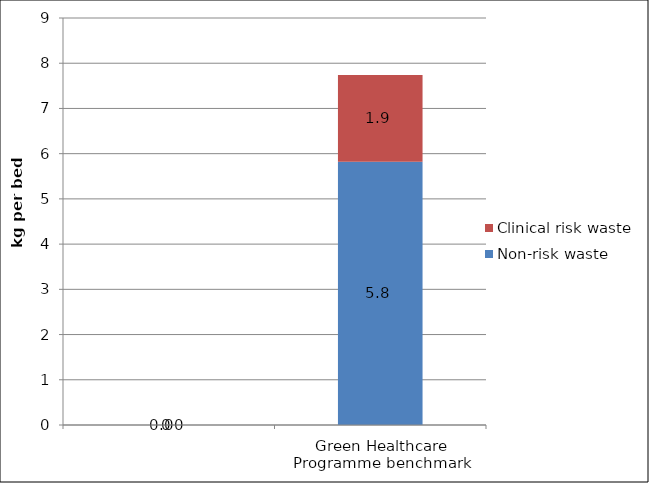
| Category | Non-risk waste | Clinical risk waste |
|---|---|---|
|  | 0 | 0 |
| Green Healthcare Programme benchmark | 5.82 | 1.92 |